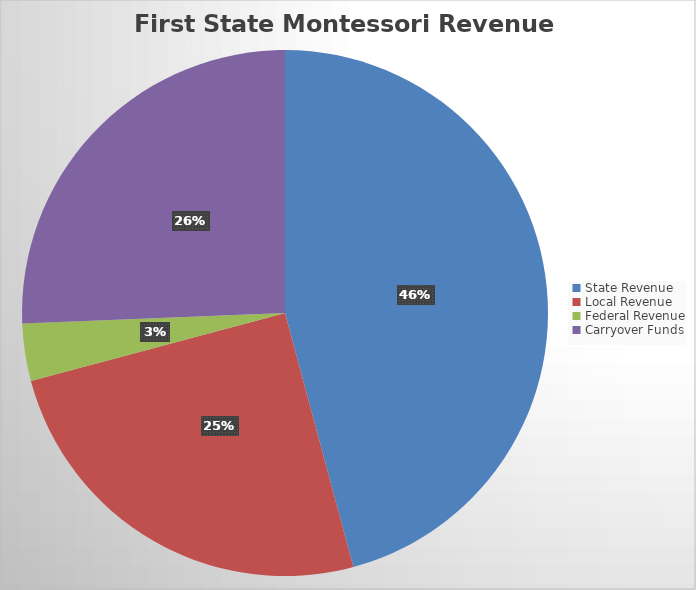
| Category | Series 0 |
|---|---|
| State Revenue | 5298867.79 |
| Local Revenue | 2894456.93 |
| Federal Revenue | 408620.84 |
| Carryover Funds | 2964231.99 |